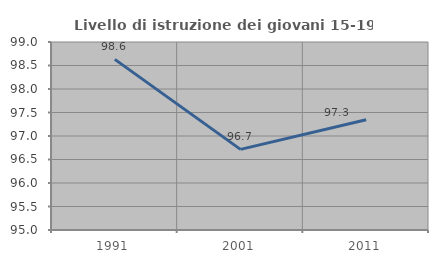
| Category | Livello di istruzione dei giovani 15-19 anni |
|---|---|
| 1991.0 | 98.63 |
| 2001.0 | 96.715 |
| 2011.0 | 97.345 |